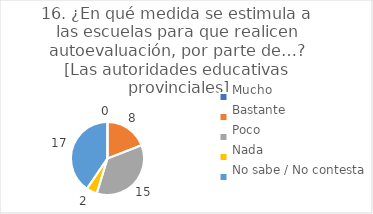
| Category | 16. ¿En qué medida se estimula a las escuelas para que realicen autoevaluación, por parte de…?
[Las autoridades educativas provinciales] |
|---|---|
| Mucho  | 0 |
| Bastante  | 0.19 |
| Poco  | 0.357 |
| Nada  | 0.048 |
| No sabe / No contesta | 0.405 |